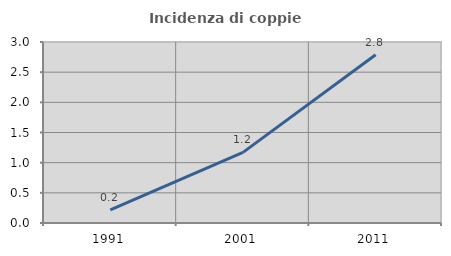
| Category | Incidenza di coppie miste |
|---|---|
| 1991.0 | 0.218 |
| 2001.0 | 1.171 |
| 2011.0 | 2.789 |